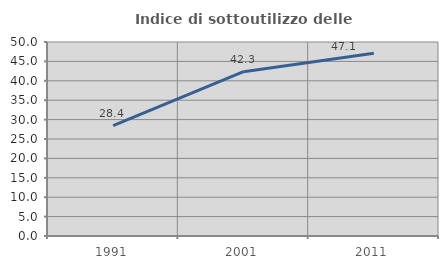
| Category | Indice di sottoutilizzo delle abitazioni  |
|---|---|
| 1991.0 | 28.441 |
| 2001.0 | 42.349 |
| 2011.0 | 47.08 |